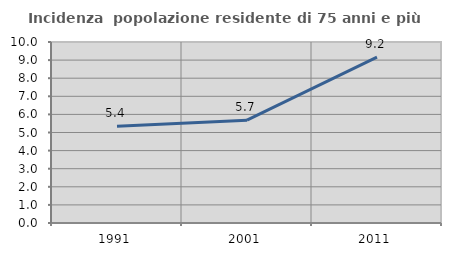
| Category | Incidenza  popolazione residente di 75 anni e più |
|---|---|
| 1991.0 | 5.351 |
| 2001.0 | 5.681 |
| 2011.0 | 9.165 |